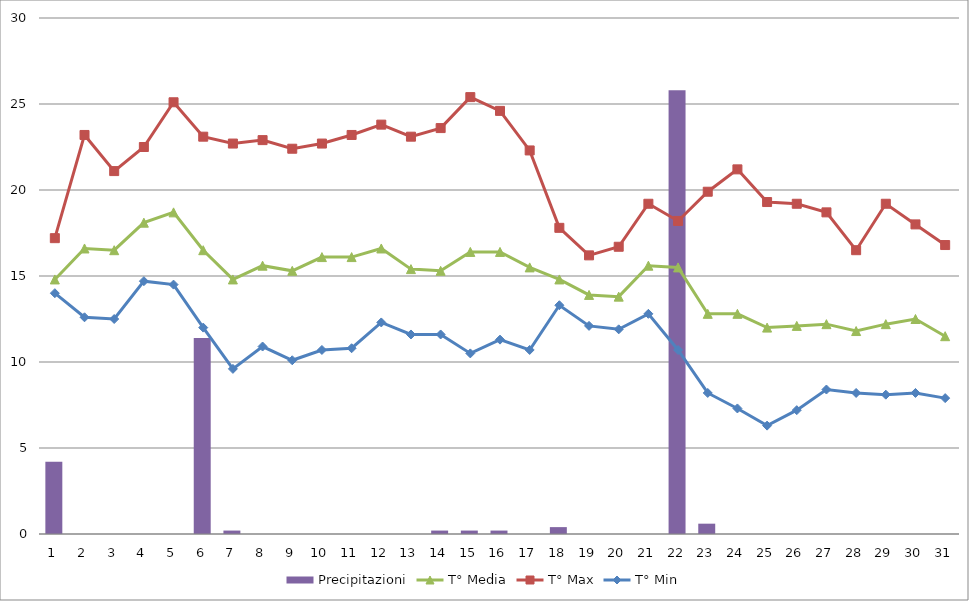
| Category | Precipitazioni |
|---|---|
| 0 | 4.2 |
| 1 | 0 |
| 2 | 0 |
| 3 | 0 |
| 4 | 0 |
| 5 | 11.4 |
| 6 | 0.2 |
| 7 | 0 |
| 8 | 0 |
| 9 | 0 |
| 10 | 0 |
| 11 | 0 |
| 12 | 0 |
| 13 | 0.2 |
| 14 | 0.2 |
| 15 | 0.2 |
| 16 | 0 |
| 17 | 0.4 |
| 18 | 0 |
| 19 | 0 |
| 20 | 0 |
| 21 | 25.8 |
| 22 | 0.6 |
| 23 | 0 |
| 24 | 0 |
| 25 | 0 |
| 26 | 0 |
| 27 | 0 |
| 28 | 0 |
| 29 | 0 |
| 30 | 0 |